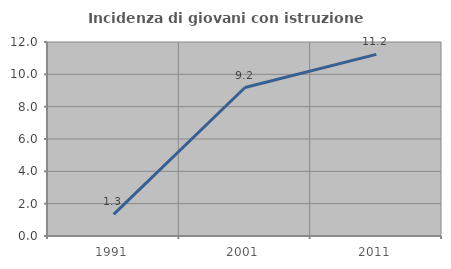
| Category | Incidenza di giovani con istruzione universitaria |
|---|---|
| 1991.0 | 1.333 |
| 2001.0 | 9.184 |
| 2011.0 | 11.236 |